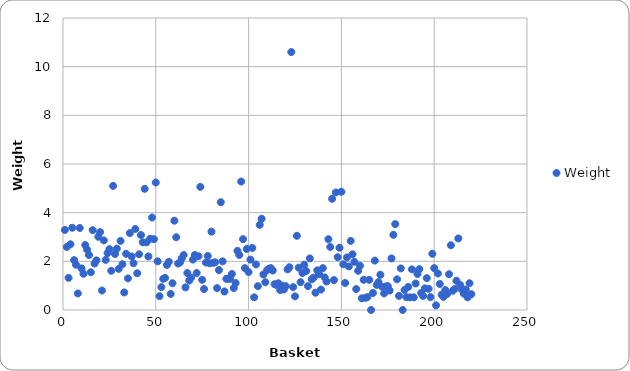
| Category | Weight |
|---|---|
| 0 | 3.29 |
| 1 | 2.59 |
| 2 | 1.32 |
| 3 | 2.7 |
| 4 | 3.38 |
| 5 | 2.05 |
| 6 | 1.86 |
| 7 | 0.68 |
| 8 | 3.37 |
| 9 | 1.71 |
| 10 | 1.49 |
| 11 | 2.67 |
| 12 | 2.48 |
| 13 | 2.26 |
| 14 | 1.55 |
| 15 | 3.28 |
| 16 | 1.91 |
| 17 | 2.04 |
| 18 | 3.01 |
| 19 | 3.2 |
| 20 | 0.8 |
| 21 | 2.86 |
| 22 | 2.06 |
| 23 | 2.34 |
| 24 | 2.5 |
| 25 | 1.61 |
| 26 | 5.1 |
| 27 | 2.3 |
| 28 | 2.52 |
| 29 | 1.69 |
| 30 | 2.84 |
| 31 | 1.88 |
| 32 | 0.72 |
| 33 | 2.31 |
| 34 | 1.3 |
| 35 | 3.16 |
| 36 | 2.2 |
| 37 | 1.92 |
| 38 | 3.33 |
| 39 | 1.51 |
| 40 | 2.29 |
| 41 | 3.08 |
| 42 | 2.78 |
| 43 | 4.98 |
| 44 | 2.78 |
| 45 | 2.2 |
| 46 | 2.93 |
| 47 | 3.8 |
| 48 | 2.91 |
| 49 | 5.24 |
| 50 | 2 |
| 51 | 0.57 |
| 52 | 0.94 |
| 53 | 1.28 |
| 54 | 1.32 |
| 55 | 1.85 |
| 56 | 1.98 |
| 57 | 0.66 |
| 58 | 1.1 |
| 59 | 3.67 |
| 60 | 2.99 |
| 61 | 1.91 |
| 62 | 1.95 |
| 63 | 2.12 |
| 64 | 2.26 |
| 65 | 0.93 |
| 66 | 1.52 |
| 67 | 1.21 |
| 68 | 1.33 |
| 69 | 2.07 |
| 70 | 2.26 |
| 71 | 1.52 |
| 72 | 2.21 |
| 73 | 5.06 |
| 74 | 1.24 |
| 75 | 0.86 |
| 76 | 1.95 |
| 77 | 2.22 |
| 78 | 1.92 |
| 79 | 3.22 |
| 80 | 1.94 |
| 81 | 1.96 |
| 82 | 0.9 |
| 83 | 1.64 |
| 84 | 4.43 |
| 85 | 2 |
| 86 | 0.76 |
| 87 | 1.28 |
| 88 | 1.29 |
| 89 | 1.28 |
| 90 | 1.48 |
| 91 | 0.9 |
| 92 | 1.11 |
| 93 | 2.43 |
| 94 | 2.26 |
| 95 | 5.28 |
| 96 | 2.91 |
| 97 | 1.72 |
| 98 | 2.51 |
| 99 | 1.56 |
| 100 | 2.07 |
| 101 | 2.55 |
| 102 | 0.52 |
| 103 | 1.87 |
| 104 | 0.98 |
| 105 | 3.5 |
| 106 | 3.75 |
| 107 | 1.46 |
| 108 | 1.14 |
| 109 | 1.64 |
| 110 | 1.7 |
| 111 | 1.72 |
| 112 | 1.62 |
| 113 | 1.06 |
| 114 | 1.03 |
| 115 | 1.1 |
| 116 | 0.82 |
| 117 | 1 |
| 118 | 0.84 |
| 119 | 0.98 |
| 120 | 1.67 |
| 121 | 1.76 |
| 122 | 10.6 |
| 123 | 0.94 |
| 124 | 0.56 |
| 125 | 3.05 |
| 126 | 1.74 |
| 127 | 1.14 |
| 128 | 1.52 |
| 129 | 1.86 |
| 130 | 1.6 |
| 131 | 0.98 |
| 132 | 2.12 |
| 133 | 1.26 |
| 134 | 1.33 |
| 135 | 0.71 |
| 136 | 1.63 |
| 137 | 1.47 |
| 138 | 0.84 |
| 139 | 1.72 |
| 140 | 1.34 |
| 141 | 1.17 |
| 142 | 2.91 |
| 143 | 2.59 |
| 144 | 4.57 |
| 145 | 1.23 |
| 146 | 4.83 |
| 147 | 2.17 |
| 148 | 2.56 |
| 149 | 4.86 |
| 150 | 1.88 |
| 151 | 1.11 |
| 152 | 2.16 |
| 153 | 1.79 |
| 154 | 2.84 |
| 155 | 2.29 |
| 156 | 1.98 |
| 157 | 0.86 |
| 158 | 1.61 |
| 159 | 1.82 |
| 160 | 0.48 |
| 161 | 1.24 |
| 162 | 0.5 |
| 163 | 0.53 |
| 164 | 1.24 |
| 165 | 0 |
| 166 | 0.7 |
| 167 | 2.03 |
| 168 | 1.03 |
| 169 | 1.15 |
| 170 | 1.45 |
| 171 | 0.95 |
| 172 | 0.68 |
| 173 | 0.97 |
| 174 | 0.98 |
| 175 | 0.8 |
| 176 | 2.12 |
| 177 | 3.09 |
| 178 | 3.53 |
| 179 | 1.26 |
| 180 | 0.58 |
| 181 | 1.71 |
| 182 | 0 |
| 183 | 0.82 |
| 184 | 0.53 |
| 185 | 0.95 |
| 186 | 0.52 |
| 187 | 1.67 |
| 188 | 0.52 |
| 189 | 1.09 |
| 190 | 1.48 |
| 191 | 1.68 |
| 192 | 0.7 |
| 193 | 0.58 |
| 194 | 0.89 |
| 195 | 1.31 |
| 196 | 0.87 |
| 197 | 0.53 |
| 198 | 2.31 |
| 199 | 1.72 |
| 200 | 0.19 |
| 201 | 1.5 |
| 202 | 1.07 |
| 203 | 0.63 |
| 204 | 0.54 |
| 205 | 0.82 |
| 206 | 0.66 |
| 207 | 1.47 |
| 208 | 2.66 |
| 209 | 0.79 |
| 210 | 0.86 |
| 211 | 1.2 |
| 212 | 2.94 |
| 213 | 1.03 |
| 214 | 0.83 |
| 215 | 0.67 |
| 216 | 0.84 |
| 217 | 0.52 |
| 218 | 1.1 |
| 219 | 0.65 |